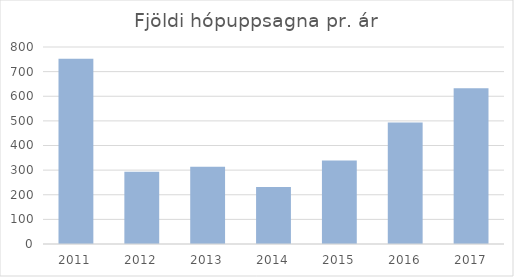
| Category | Series 0 |
|---|---|
| 2011 | 752 |
| 2012 | 293 |
| 2013 | 314 |
| 2014 | 231 |
| 2015 | 339 |
| 2016 | 493 |
| 2017 | 632 |